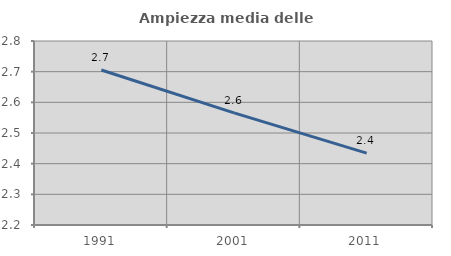
| Category | Ampiezza media delle famiglie |
|---|---|
| 1991.0 | 2.706 |
| 2001.0 | 2.565 |
| 2011.0 | 2.434 |